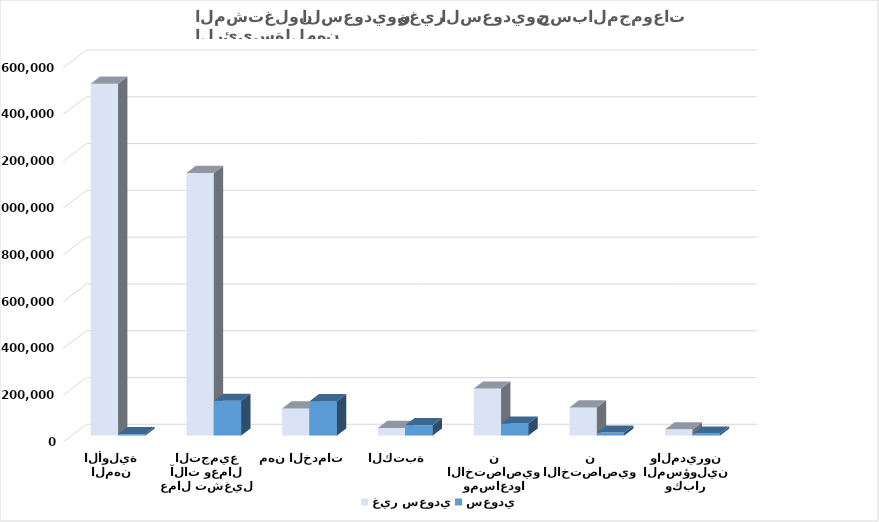
| Category | غير سعودي  | سعودي  |
|---|---|---|
| المشرعون وكبار المسؤولين والمديرون | 26605 | 8423 |
| الاختصاصيون | 120217 | 12625 |
| الفنيون ومساعدوا الاختصاصيون | 201043 | 51496 |
| الكتبة | 32499 | 44531 |
| مهن الخدمات | 115855 | 147059 |
| عمال تشغيل آلات وعمال التجميع | 1122653 | 148799 |
| المهن الأولية | 1504058 | 6134 |